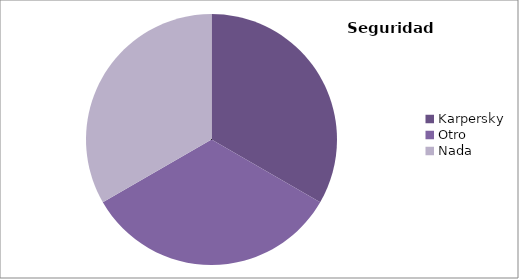
| Category | Series 0 |
|---|---|
| Karpersky  | 2 |
| Otro  | 2 |
| Nada | 2 |